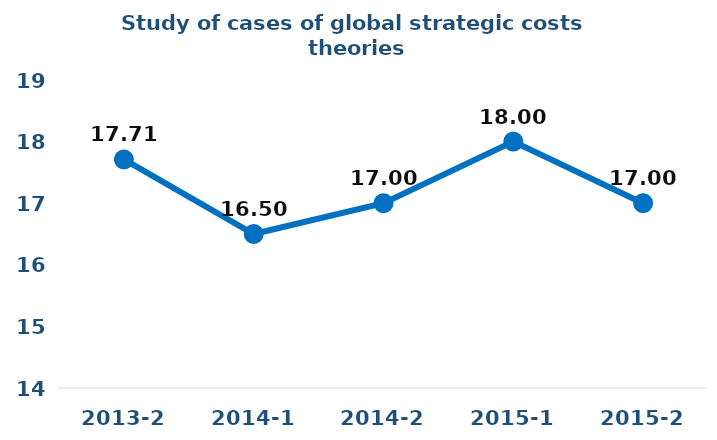
| Category | Series 0 |
|---|---|
| 2013-2 | 17.71 |
| 2014-1 | 16.5 |
| 2014-2 | 17 |
| 2015-1 | 18 |
| 2015-2 | 17 |